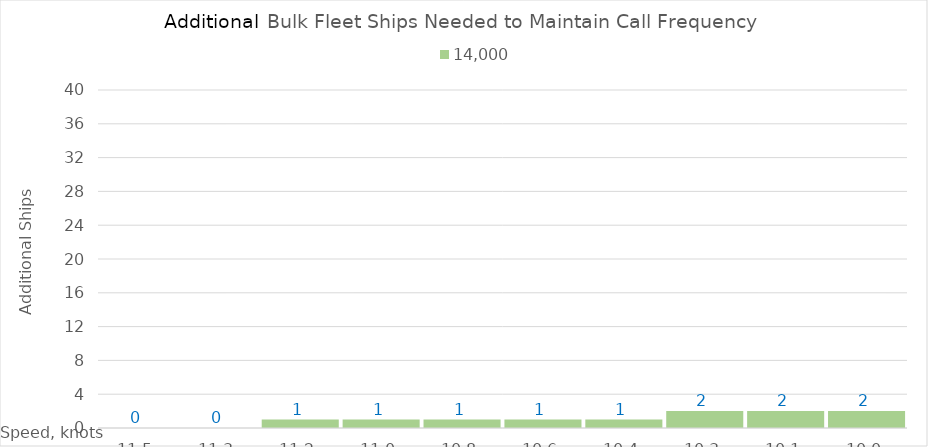
| Category | 14,000 |
|---|---|
| 11.52 | 0 |
| 11.34 | 0 |
| 11.16 | 1 |
| 10.98 | 1 |
| 10.8 | 1 |
| 10.620000000000001 | 1 |
| 10.440000000000001 | 1 |
| 10.260000000000002 | 2 |
| 10.080000000000002 | 2 |
| 10.0 | 2 |